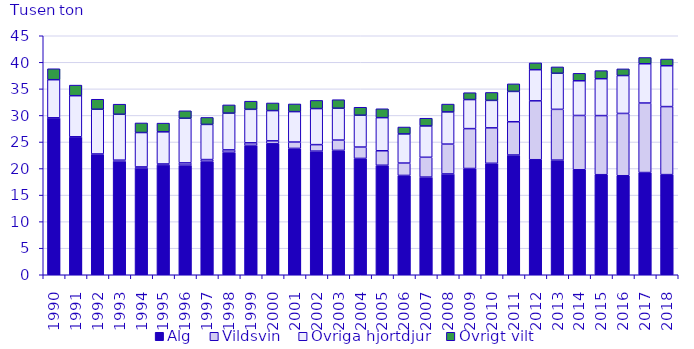
| Category | Älg | Vildsvin | Övriga hjortdjur | Övrigt vilt |
|---|---|---|---|---|
| 1990.0 | 29.516 | 0.038 | 7.172 | 2.058 |
| 1991.0 | 25.913 | 0.066 | 7.734 | 1.995 |
| 1992.0 | 22.67 | 0.073 | 8.416 | 1.885 |
| 1993.0 | 21.398 | 0.178 | 8.637 | 1.903 |
| 1994.0 | 20.117 | 0.187 | 6.471 | 1.808 |
| 1995.0 | 20.688 | 0.173 | 6.051 | 1.637 |
| 1996.0 | 20.644 | 0.419 | 8.402 | 1.405 |
| 1997.0 | 21.34 | 0.347 | 6.62 | 1.314 |
| 1998.0 | 23.061 | 0.451 | 6.923 | 1.547 |
| 1999.0 | 24.364 | 0.477 | 6.306 | 1.536 |
| 2000.0 | 24.676 | 0.539 | 5.693 | 1.438 |
| 2001.0 | 23.79 | 1.198 | 5.726 | 1.445 |
| 2002.0 | 23.278 | 1.222 | 6.787 | 1.542 |
| 2003.0 | 23.415 | 1.941 | 6.001 | 1.602 |
| 2004.0 | 21.905 | 2.139 | 5.993 | 1.502 |
| 2005.0 | 20.615 | 2.732 | 6.232 | 1.674 |
| 2006.0 | 18.701 | 2.328 | 5.489 | 1.3 |
| 2007.0 | 18.385 | 3.733 | 5.903 | 1.451 |
| 2008.0 | 18.981 | 5.617 | 6.064 | 1.474 |
| 2009.0 | 20.007 | 7.509 | 5.467 | 1.296 |
| 2010.0 | 20.985 | 6.672 | 5.173 | 1.495 |
| 2011.0 | 22.547 | 6.262 | 5.709 | 1.424 |
| 2012.0 | 21.658 | 11.091 | 5.858 | 1.282 |
| 2013.0 | 21.582 | 9.562 | 6.793 | 1.197 |
| 2014.0 | 19.77 | 10.219 | 6.536 | 1.401 |
| 2015.0 | 18.84 | 11.129 | 6.942 | 1.525 |
| 2016.0 | 18.641 | 11.733 | 7.134 | 1.255 |
| 2017.0 | 19.246 | 13.091 | 7.39 | 1.178 |
| 2018.0 | 18.854 | 12.808 | 7.686 | 1.268 |